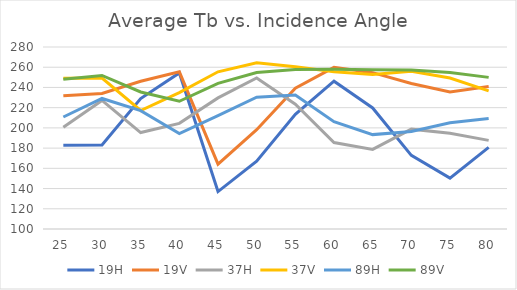
| Category | 19H | 19V | 37H | 37V | 89H | 89V |
|---|---|---|---|---|---|---|
| 25.0 | 182.772 | 231.731 | 200.707 | 249.214 | 210.768 | 248.157 |
| 30.0 | 183.165 | 234.096 | 227.146 | 249.328 | 229.098 | 251.849 |
| 35.0 | 229.042 | 246.16 | 195.376 | 217.188 | 217.074 | 235.544 |
| 40.0 | 254.34 | 255.427 | 204.476 | 234.838 | 194.366 | 226.304 |
| 45.0 | 137.013 | 164.163 | 229.652 | 255.478 | 212.022 | 244.066 |
| 50.0 | 167.039 | 198.167 | 249.356 | 264.313 | 230.297 | 254.828 |
| 55.0 | 213.477 | 239.258 | 223.403 | 260.54 | 232.489 | 257.802 |
| 60.0 | 246.22 | 259.846 | 185.472 | 255.549 | 206.139 | 257.916 |
| 65.0 | 219.713 | 254.608 | 178.717 | 252.763 | 193.351 | 257.602 |
| 70.0 | 172.824 | 243.87 | 198.757 | 256.029 | 196.371 | 257.317 |
| 75.0 | 150.361 | 235.492 | 194.599 | 249.284 | 204.983 | 254.782 |
| 80.0 | 180.759 | 240.895 | 187.644 | 236.665 | 209.336 | 249.969 |